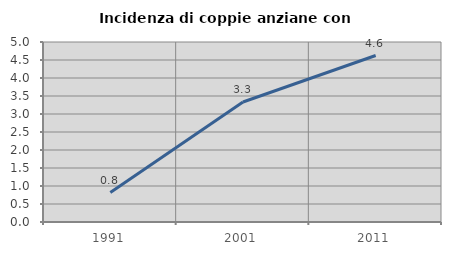
| Category | Incidenza di coppie anziane con figli |
|---|---|
| 1991.0 | 0.817 |
| 2001.0 | 3.333 |
| 2011.0 | 4.624 |